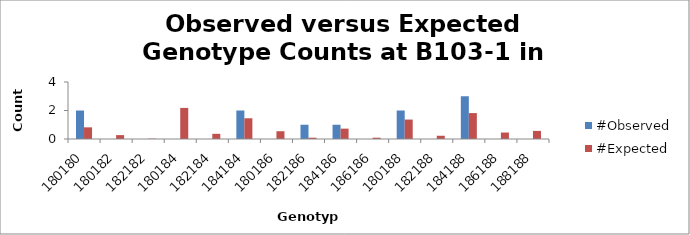
| Category | #Observed | #Expected |
|---|---|---|
| 180180.0 | 2 | 0.818 |
| 180182.0 | 0 | 0.273 |
| 182182.0 | 0 | 0.023 |
| 180184.0 | 0 | 2.182 |
| 182184.0 | 0 | 0.364 |
| 184184.0 | 2 | 1.455 |
| 180186.0 | 0 | 0.545 |
| 182186.0 | 1 | 0.091 |
| 184186.0 | 1 | 0.727 |
| 186186.0 | 0 | 0.091 |
| 180188.0 | 2 | 1.364 |
| 182188.0 | 0 | 0.227 |
| 184188.0 | 3 | 1.818 |
| 186188.0 | 0 | 0.455 |
| 188188.0 | 0 | 0.568 |